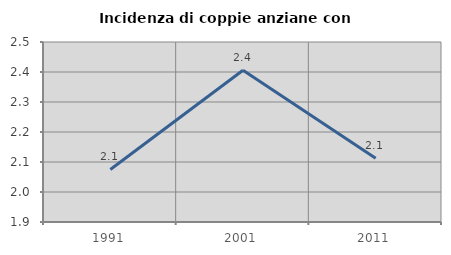
| Category | Incidenza di coppie anziane con figli |
|---|---|
| 1991.0 | 2.075 |
| 2001.0 | 2.406 |
| 2011.0 | 2.113 |